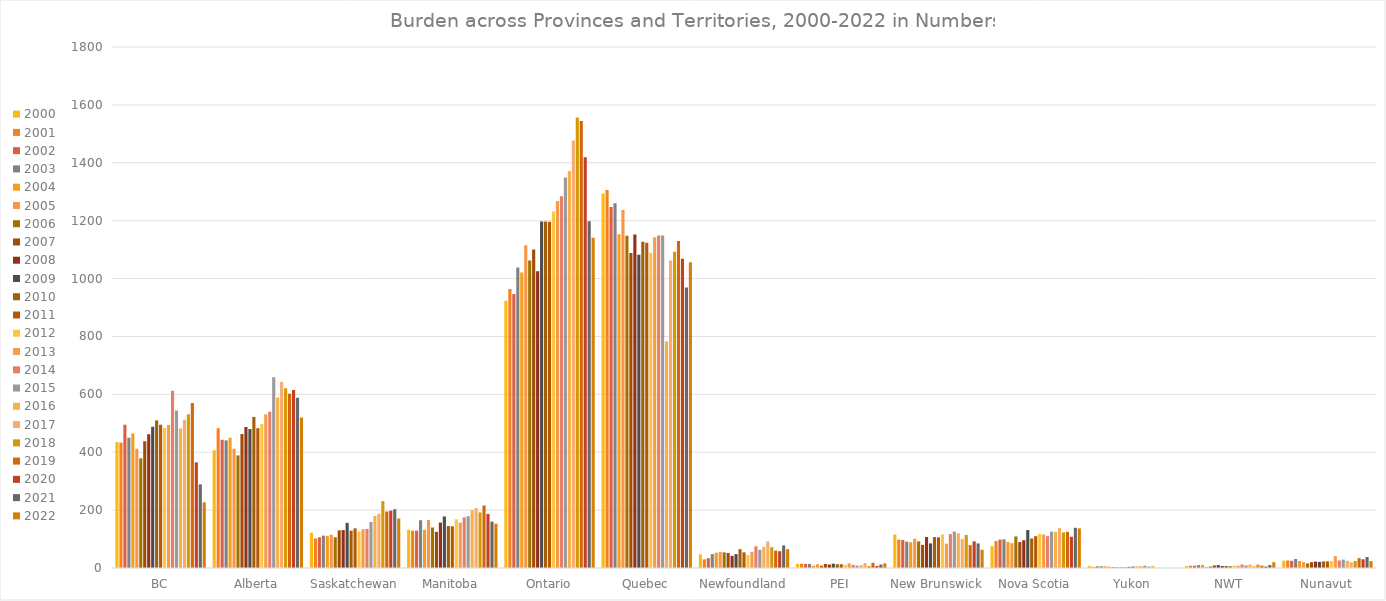
| Category | 2000 | 2001 | 2002 | 2003 | 2004 | 2005 | 2006 | 2007 | 2008 | 2009 | 2010 | 2011 | 2012 | 2013 | 2014 | 2015 | 2016 | 2017 | 2018 | 2019 | 2020 | 2021 | 2022 |
|---|---|---|---|---|---|---|---|---|---|---|---|---|---|---|---|---|---|---|---|---|---|---|---|
| BC | 435 | 433 | 495 | 450 | 465 | 412 | 379 | 438 | 462 | 488 | 510 | 495 | 484 | 494 | 612 | 544 | 482 | 512 | 531 | 570 | 365 | 289 | 227 |
| Alberta | 407 | 483 | 443 | 441 | 450 | 412 | 389 | 463 | 487 | 480 | 522 | 483 | 498 | 531 | 540 | 659 | 589 | 643 | 621 | 602 | 615 | 588 | 520 |
| Saskatchewan | 122 | 102 | 106 | 112 | 111 | 115 | 106 | 130 | 131 | 156 | 129 | 137 | 126 | 134 | 135 | 159 | 180 | 187 | 231 | 195 | 198 | 203 | 171 |
| Manitoba | 132 | 129 | 129 | 165 | 132 | 166 | 140 | 125 | 157 | 178 | 145 | 144 | 168 | 157 | 175 | 179 | 200 | 207 | 192 | 216 | 187 | 160 | 153 |
| Ontario | 923 | 964 | 947 | 1038 | 1021 | 1115 | 1062 | 1100 | 1025 | 1197 | 1197 | 1196 | 1232 | 1268 | 1284 | 1349 | 1372 | 1477 | 1556 | 1544 | 1419 | 1198 | 1141 |
| Quebec | 1294 | 1306 | 1247 | 1260 | 1153 | 1237 | 1148 | 1088 | 1152 | 1082 | 1127 | 1124 | 1089 | 1143 | 1149 | 1149 | 783 | 1062 | 1093 | 1130 | 1068 | 969 | 1056 |
| Newfoundland | 47 | 30 | 34 | 48 | 53 | 55 | 54 | 52 | 42 | 48 | 65 | 54 | 45 | 56 | 75 | 63 | 73 | 92 | 72 | 60 | 58 | 78 | 65 |
| PEI | 14 | 15 | 14 | 14 | 8 | 13 | 8 | 14 | 12 | 15 | 13 | 13 | 11 | 16 | 11 | 8 | 10 | 17 | 7 | 18 | 7 | 12 | 16 |
| New Brunswick | 116 | 98 | 97 | 91 | 89 | 101 | 92 | 80 | 107 | 85 | 107 | 106 | 116 | 84 | 117 | 126 | 120 | 100 | 114 | 79 | 92 | 85 | 63 |
| Nova Scotia | 75 | 93 | 98 | 99 | 90 | 86 | 109 | 90 | 96 | 131 | 102 | 110 | 118 | 116 | 110 | 126 | 125 | 138 | 123 | 125 | 108 | 139 | 137 |
| Yukon | 7 | 4 | 6 | 6 | 6 | 5 | 3 | 2 | 2 | 2 | 4 | 5 | 7 | 6 | 8 | 5 | 7 | 0 | 0 | 0 | 0 | 0 | 0 |
| NWT | 7 | 8 | 8 | 10 | 11 | 4 | 5 | 9 | 10 | 7 | 7 | 6 | 8 | 8 | 12 | 9 | 12 | 7 | 12 | 8 | 5 | 10 | 20 |
| Nunavut | 25 | 26 | 25 | 31 | 24 | 20 | 16 | 20 | 22 | 21 | 23 | 23 | 24 | 41 | 26 | 29 | 25 | 20 | 24 | 34 | 30 | 38 | 24 |